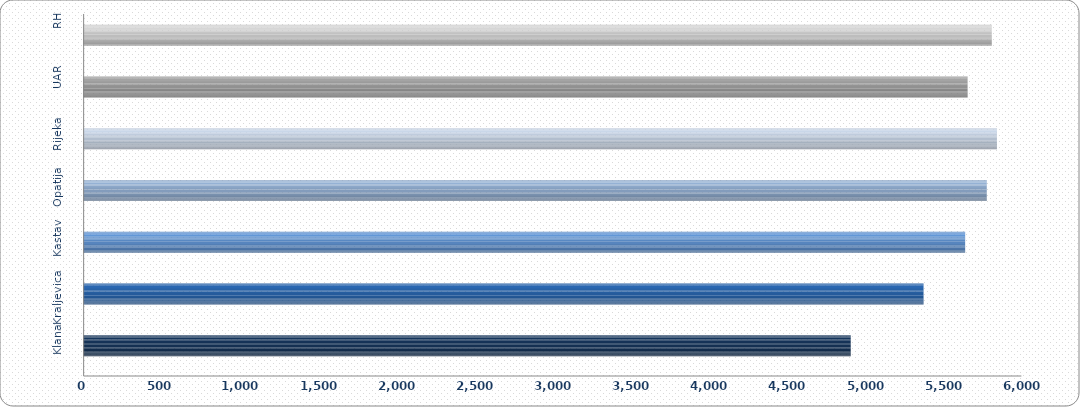
| Category | 4.912 5.378 5.644 5.783 5.848 5.660 5.815 |
|---|---|
| Klana | 4912.137 |
| Kraljevica | 5378.105 |
| Kastav | 5644.338 |
| Opatija | 5782.701 |
| Rijeka | 5847.649 |
| UAR | 5660 |
| RH | 5814.763 |